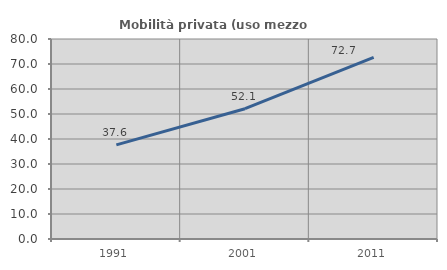
| Category | Mobilità privata (uso mezzo privato) |
|---|---|
| 1991.0 | 37.638 |
| 2001.0 | 52.119 |
| 2011.0 | 72.665 |